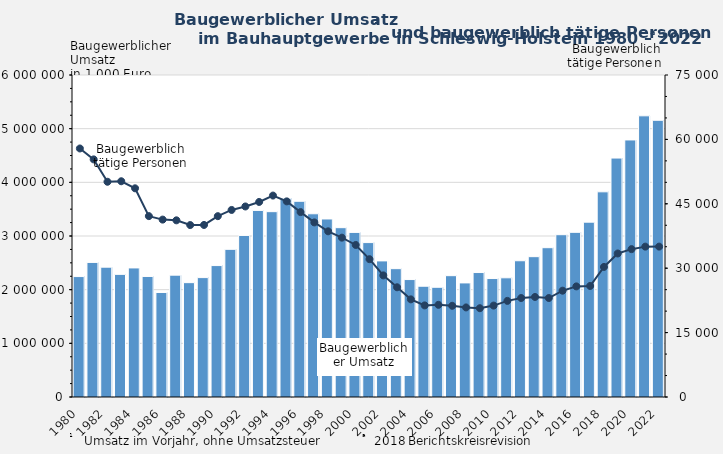
| Category | Baugewerblicher 
Umsatz in 1000 Euro |
|---|---|
| 1980.0 | 2243938 |
| 1981.0 | 2507741 |
| 1982.0 | 2419292 |
| 1983.0 | 2285011 |
| 1984.0 | 2404975 |
| 1985.0 | 2245931 |
| 1986.0 | 1947650 |
| 1987.0 | 2270584 |
| 1988.0 | 2130717 |
| 1989.0 | 2224899 |
| 1990.0 | 2449116 |
| 1991.0 | 2751377 |
| 1992.0 | 3010338 |
| 1993.0 | 3476875 |
| 1994.0 | 3453560 |
| 1995.0 | 3703125 |
| 1996.0 | 3646830 |
| 1997.0 | 3414109 |
| 1998.0 | 3317273 |
| 1999.0 | 3154963 |
| 2000.0 | 3067211 |
| 2001.0 | 2877358 |
| 2002.0 | 2536088 |
| 2003.0 | 2391237 |
| 2004.0 | 2188519 |
| 2005.0 | 2064179 |
| 2006.0 | 2044588 |
| 2007.0 | 2260543 |
| 2008.0 | 2125896 |
| 2009.0 | 2319249 |
| 2010.0 | 2207465 |
| 2011.0 | 2220922 |
| 2012.0 | 2538836 |
| 2013.0 | 2615095 |
| 2014.0 | 2781930 |
| 2015.0 | 3024321 |
| 2016.0 | 3068162 |
| 2017.0 | 3257770 |
| 2018.0 | 3823207 |
| 2019.0 | 4452522 |
| 2020.0 | 4789743 |
| 2021.0 | 5239511 |
| 2022.0 | 5156022 |